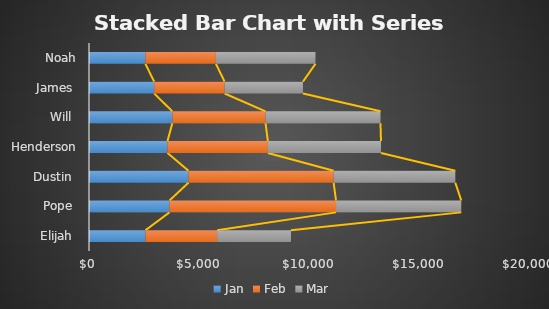
| Category | Jan | Feb | Mar |
|---|---|---|---|
| Elijah  | 2569 | 3256 | 3356 |
| Pope  | 3659 | 7569 | 5693 |
| Dustin  | 4523 | 6596 | 5532 |
| Henderson | 3568 | 4562 | 5142 |
| Will  | 3789 | 4236 | 5224 |
| James  | 2963 | 3201 | 3562 |
| Noah | 2563 | 3205 | 4526 |